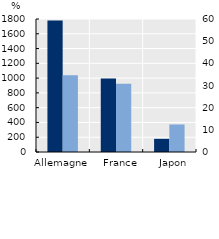
| Category | 2020 | 2010 |
|---|---|---|
| Allemagne | 1778.944 | 1037.041 |
|     France | 993.604 | 923.735 |
|     Japon | 178.138 | 372.758 |